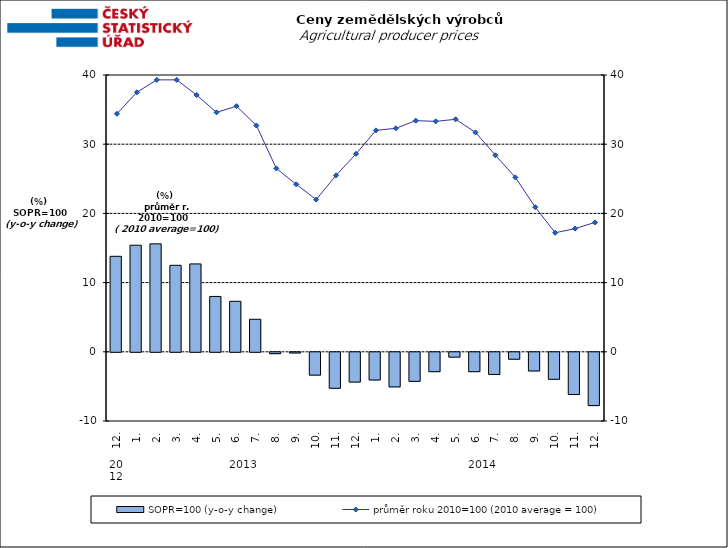
| Category | SOPR=100 (y-o-y change)   |
|---|---|
| 0 | 13.8 |
| 1 | 15.4 |
| 2 | 15.6 |
| 3 | 12.5 |
| 4 | 12.7 |
| 5 | 8 |
| 6 | 7.3 |
| 7 | 4.7 |
| 8 | -0.2 |
| 9 | -0.1 |
| 10 | -3.3 |
| 11 | -5.2 |
| 12 | -4.3 |
| 13 | -4 |
| 14 | -5 |
| 15 | -4.2 |
| 16 | -2.8 |
| 17 | -0.7 |
| 18 | -2.8 |
| 19 | -3.2 |
| 20 | -1 |
| 21 | -2.7 |
| 22 | -3.9 |
| 23 | -6.1 |
| 24 | -7.7 |